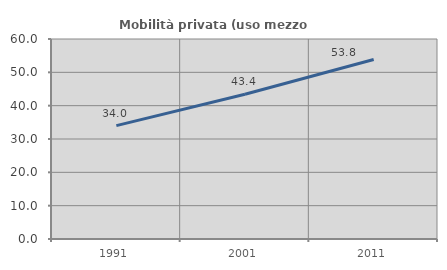
| Category | Mobilità privata (uso mezzo privato) |
|---|---|
| 1991.0 | 34.022 |
| 2001.0 | 43.421 |
| 2011.0 | 53.846 |